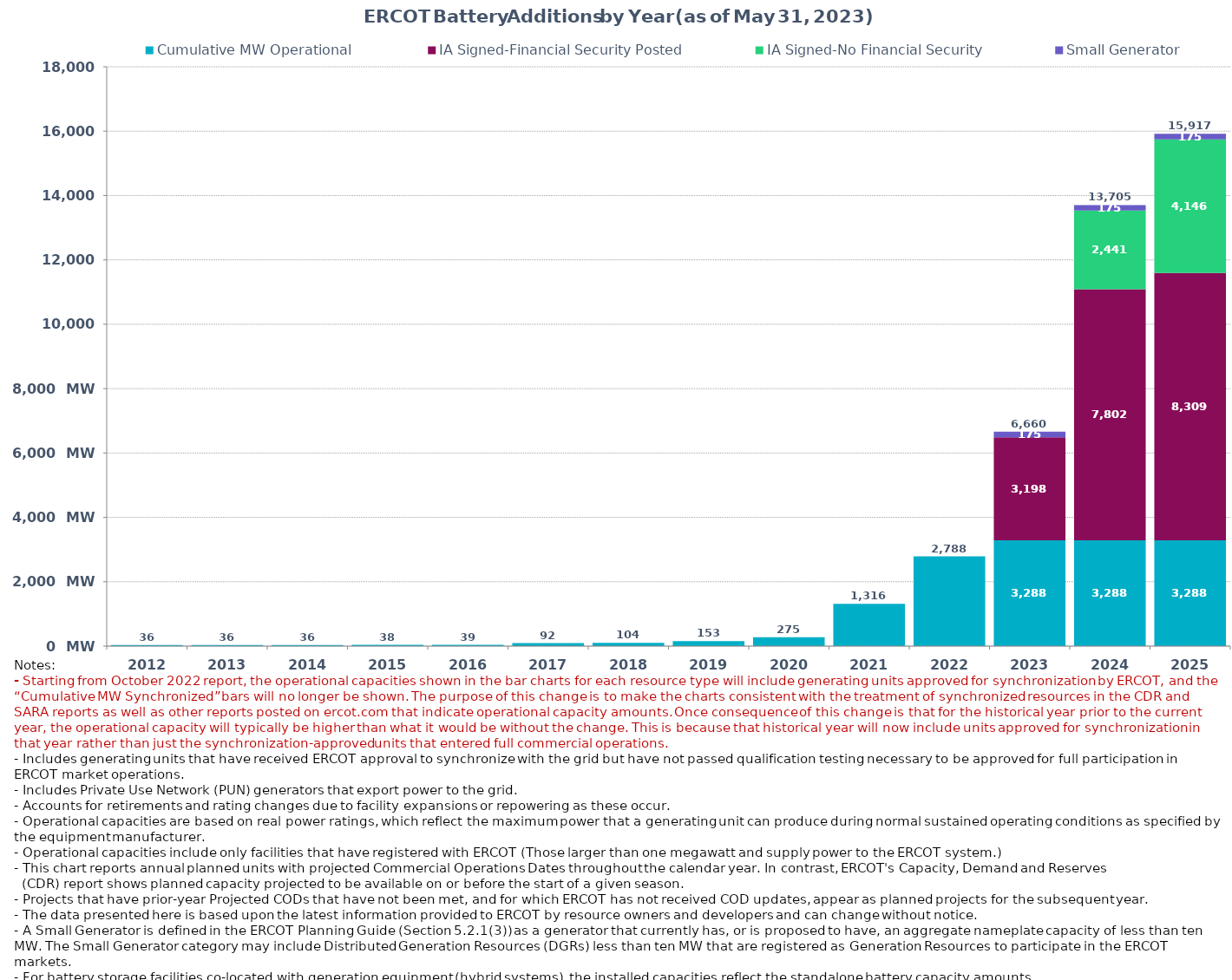
| Category | Cumulative MW Operational  | IA Signed-Financial Security Posted  | IA Signed-No Financial Security  | Small Generator | Cumulative Installed and Planned |
|---|---|---|---|---|---|
| 2012.0 | 36 | 0 | 0 | 0 | 36 |
| 2013.0 | 36 | 0 | 0 | 0 | 36 |
| 2014.0 | 36 | 0 | 0 | 0 | 36 |
| 2015.0 | 38 | 0 | 0 | 0 | 38 |
| 2016.0 | 39 | 0 | 0 | 0 | 39 |
| 2017.0 | 92.3 | 0 | 0 | 0 | 92.3 |
| 2018.0 | 103.7 | 0 | 0 | 0 | 103.7 |
| 2019.0 | 153.3 | 0 | 0 | 0 | 153.3 |
| 2020.0 | 275.4 | 0 | 0 | 0 | 275.4 |
| 2021.0 | 1316.43 | 0 | 0 | 0 | 1316.43 |
| 2022.0 | 2787.86 | 0 | 0 | 0 | 2787.86 |
| 2023.0 | 3287.56 | 3198.04 | 0 | 174.5 | 6660.1 |
| 2024.0 | 3287.56 | 7801.99 | 2441.38 | 174.5 | 13705.43 |
| 2025.0 | 3287.56 | 8308.91 | 4145.55 | 174.5 | 15916.52 |